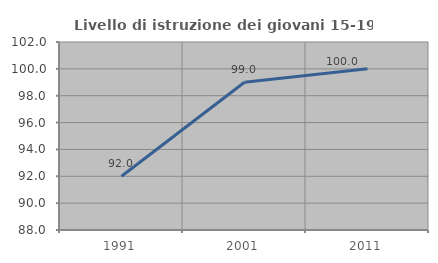
| Category | Livello di istruzione dei giovani 15-19 anni |
|---|---|
| 1991.0 | 92 |
| 2001.0 | 99 |
| 2011.0 | 100 |